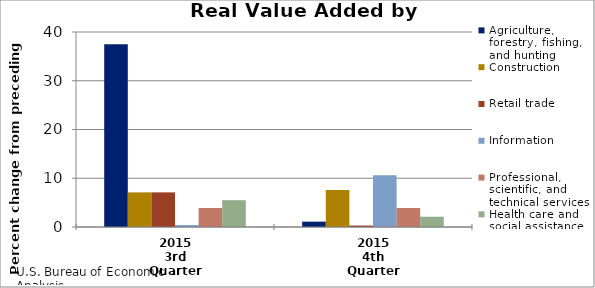
| Category | Agriculture, forestry, fishing, and hunting | Construction | Retail trade | Information | Professional, scientific, and technical services | Health care and social assistance |
|---|---|---|---|---|---|---|
| 2015
3rd Quarter | 37.5 | 7.1 | 7.1 | 0.4 | 3.9 | 5.5 |
| 2015
4th Quarter | 1.1 | 7.6 | 0.3 | 10.6 | 3.9 | 2.1 |